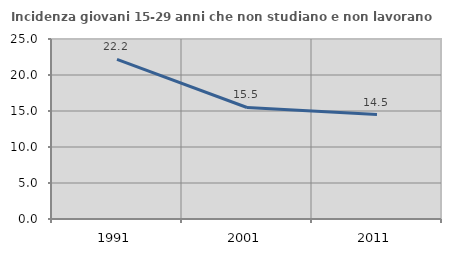
| Category | Incidenza giovani 15-29 anni che non studiano e non lavorano  |
|---|---|
| 1991.0 | 22.177 |
| 2001.0 | 15.487 |
| 2011.0 | 14.508 |